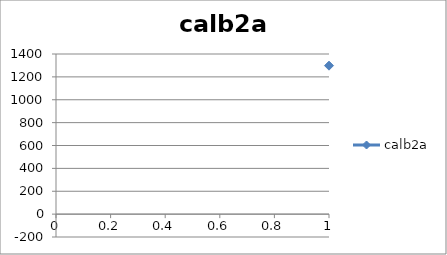
| Category | calb2a |
|---|---|
| 0 | 1298 |
| 1 | 205 |
| 2 | 103 |
| 3 | 85 |
| 4 | 83 |
| 5 | 8 |
| 6 | 204 |
| 7 | 1 |
| 8 | 11 |
| 9 | 54 |
| 10 | 212 |